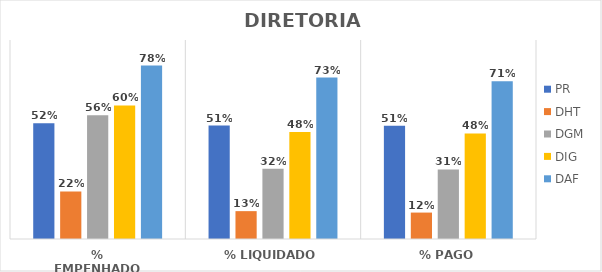
| Category | PR | DHT | DGM | DIG | DAF |
|---|---|---|---|---|---|
| % EMPENHADO | 0.523 | 0.215 | 0.56 | 0.604 | 0.785 |
| % LIQUIDADO | 0.513 | 0.126 | 0.318 | 0.484 | 0.73 |
| % PAGO | 0.512 | 0.119 | 0.315 | 0.477 | 0.714 |